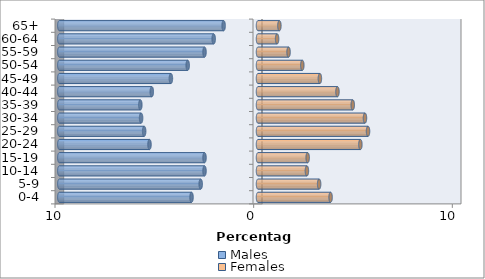
| Category | Males | Females |
|---|---|---|
| 0-4 | -3.346 | 3.654 |
| 5-9 | -2.885 | 3.077 |
| 10-14 | -2.692 | 2.462 |
| 15-19 | -2.692 | 2.5 |
| 20-24 | -5.462 | 5.154 |
| 25-29 | -5.731 | 5.538 |
| 30-34 | -5.885 | 5.385 |
| 35-39 | -5.923 | 4.769 |
| 40-44 | -5.346 | 4 |
| 45-49 | -4.385 | 3.115 |
| 50-54 | -3.538 | 2.231 |
| 55-59 | -2.692 | 1.538 |
| 60-64 | -2.231 | 0.962 |
| 65+ | -1.731 | 1.077 |